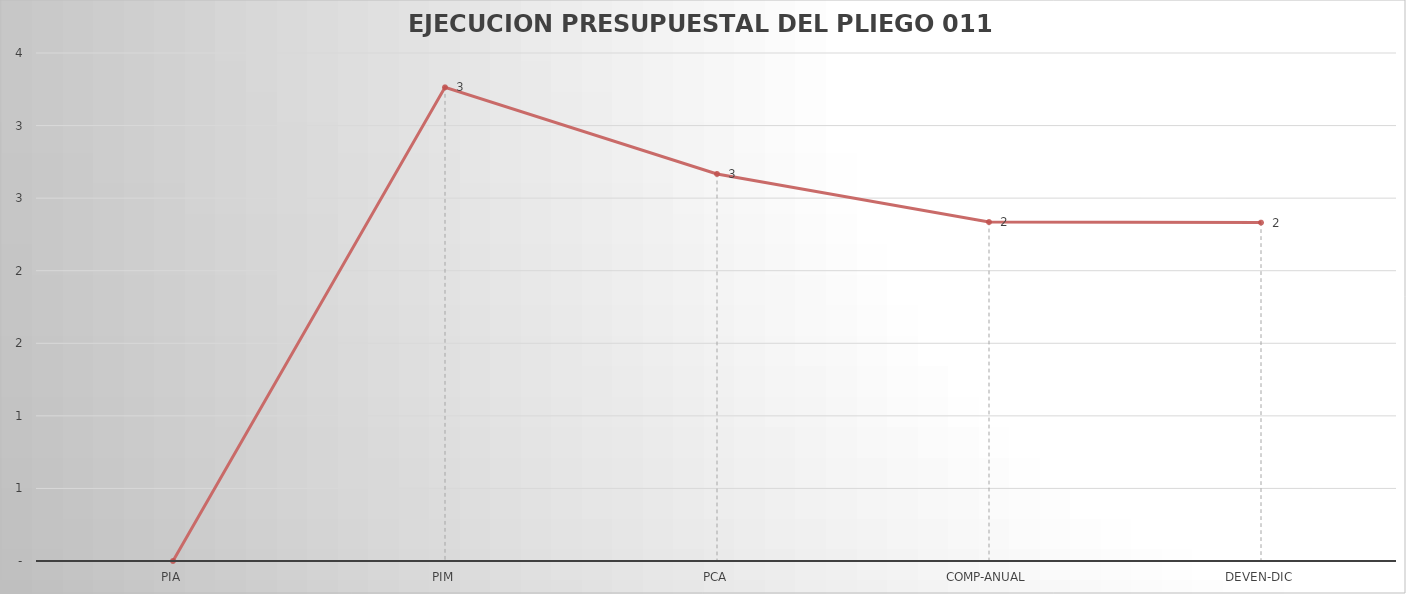
| Category | Series 0 |
|---|---|
| PIA | 0 |
| PIM | 3.264 |
| PCA | 2.667 |
| COMP-ANUAL | 2.335 |
| DEVEN-DIC | 2.331 |